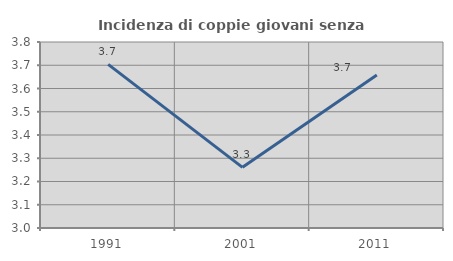
| Category | Incidenza di coppie giovani senza figli |
|---|---|
| 1991.0 | 3.704 |
| 2001.0 | 3.261 |
| 2011.0 | 3.659 |